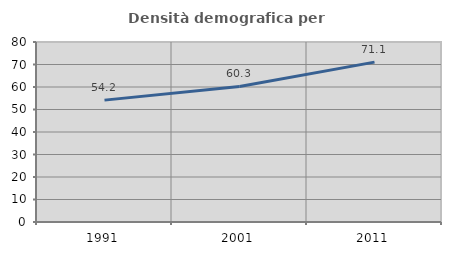
| Category | Densità demografica |
|---|---|
| 1991.0 | 54.169 |
| 2001.0 | 60.265 |
| 2011.0 | 71.064 |